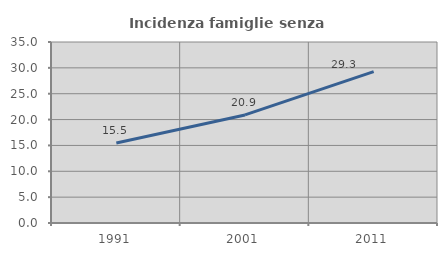
| Category | Incidenza famiglie senza nuclei |
|---|---|
| 1991.0 | 15.476 |
| 2001.0 | 20.897 |
| 2011.0 | 29.26 |